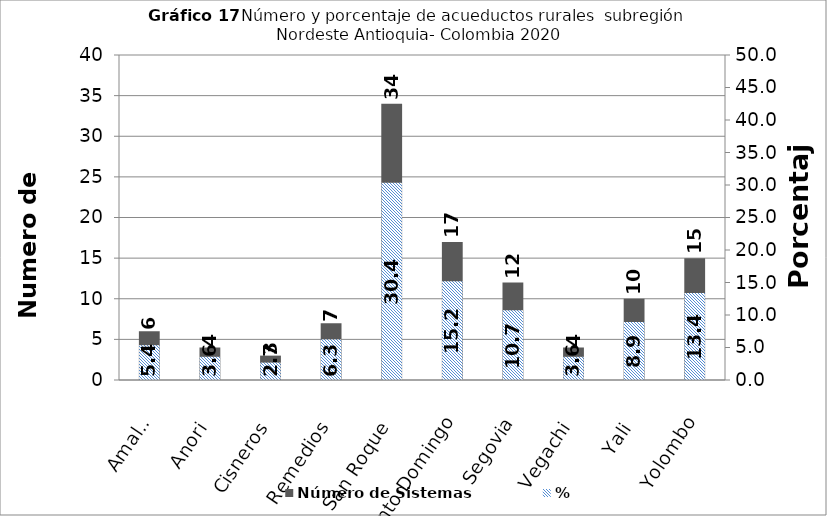
| Category | Número de Sistemas |
|---|---|
| Amalfi | 6 |
| Anori | 4 |
| Cisneros | 3 |
| Remedios | 7 |
| San Roque | 34 |
| Santo Domingo | 17 |
| Segovia | 12 |
| Vegachi | 4 |
| Yali | 10 |
| Yolombo | 15 |